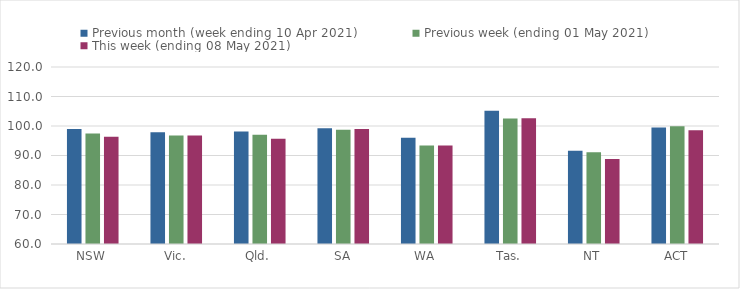
| Category | Previous month (week ending 10 Apr 2021) | Previous week (ending 01 May 2021) | This week (ending 08 May 2021) |
|---|---|---|---|
| NSW | 98.98 | 97.48 | 96.39 |
| Vic. | 97.88 | 96.77 | 96.77 |
| Qld. | 98.12 | 97.07 | 95.65 |
| SA | 99.26 | 98.76 | 99 |
| WA | 96.03 | 93.38 | 93.42 |
| Tas. | 105.21 | 102.58 | 102.6 |
| NT | 91.58 | 91.1 | 88.81 |
| ACT | 99.5 | 99.92 | 98.56 |